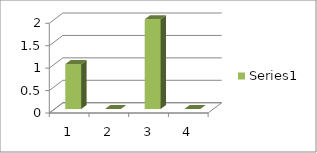
| Category | Series 0 |
|---|---|
| 0 | 1 |
| 1 | 0 |
| 2 | 2 |
| 3 | 0 |